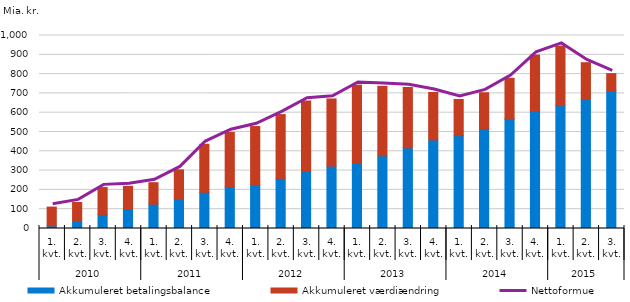
| Category | Akkumuleret betalingsbalance | Akkumuleret værdiændring |
|---|---|---|
| 0 | 13.1 | 97.9 |
| 1 | 39.3 | 95.6 |
| 2 | 72.9 | 139.2 |
| 3 | 103.2 | 115.3 |
| 4 | 126 | 111.5 |
| 5 | 153 | 151.1 |
| 6 | 187.7 | 248.6 |
| 7 | 215.5 | 282.3 |
| 8 | 225.7 | 302.6 |
| 9 | 259.9 | 330.4 |
| 10 | 294.9 | 365.8 |
| 11 | 323.1 | 348.2 |
| 12 | 339.4 | 403.4 |
| 13 | 376.8 | 359.8 |
| 14 | 417.9 | 312.7 |
| 15 | 458.9 | 246.1 |
| 16 | 481.2 | 187.4 |
| 17 | 518.1 | 185.3 |
| 18 | 567.1 | 211.1 |
| 19 | 608.5 | 290 |
| 20 | 636.6 | 308.6 |
| 21 | 668.3 | 190.9 |
| 22 | 713.3 | 89.4 |